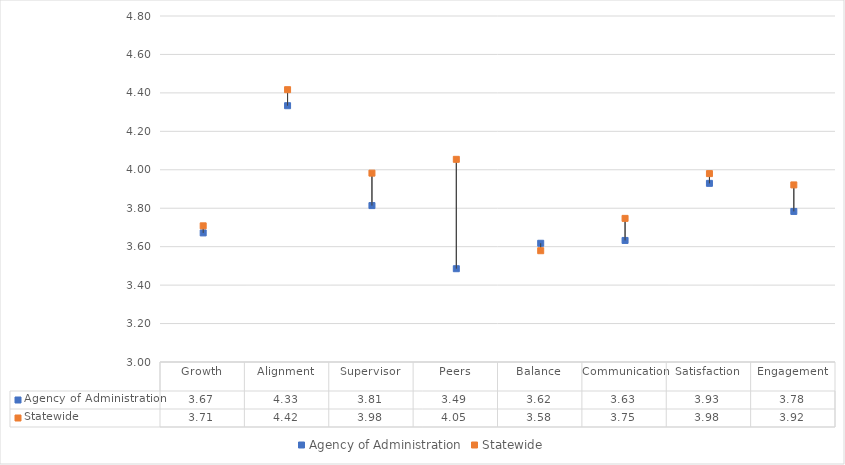
| Category | Agency of Administration | Statewide |
|---|---|---|
| Growth | 3.672 | 3.708 |
| Alignment | 4.333 | 4.417 |
| Supervisor | 3.814 | 3.983 |
| Peers | 3.485 | 4.054 |
| Balance | 3.618 | 3.579 |
| Communication | 3.632 | 3.747 |
| Satisfaction | 3.929 | 3.98 |
| Engagement | 3.783 | 3.921 |